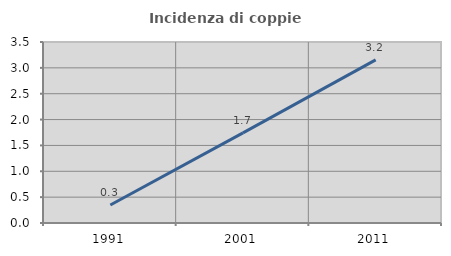
| Category | Incidenza di coppie miste |
|---|---|
| 1991.0 | 0.347 |
| 2001.0 | 1.742 |
| 2011.0 | 3.155 |